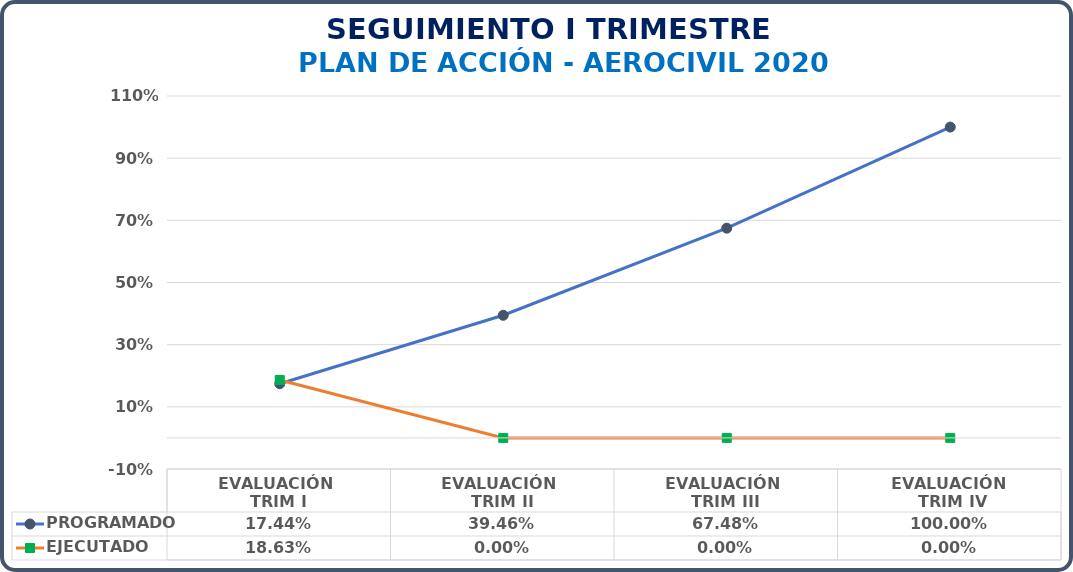
| Category | PROGRAMADO | EJECUTADO |
|---|---|---|
| EVALUACIÓN 
TRIM I | 0.174 | 0.186 |
| EVALUACIÓN 
TRIM II | 0.395 | 0 |
| EVALUACIÓN 
TRIM III | 0.675 | 0 |
| EVALUACIÓN
 TRIM IV | 1 | 0 |